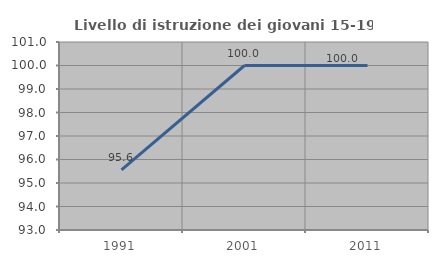
| Category | Livello di istruzione dei giovani 15-19 anni |
|---|---|
| 1991.0 | 95.556 |
| 2001.0 | 100 |
| 2011.0 | 100 |